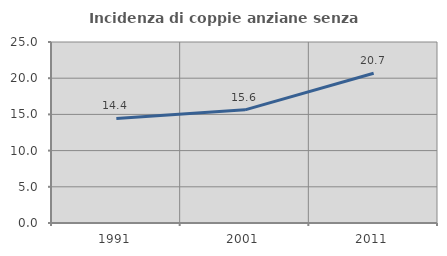
| Category | Incidenza di coppie anziane senza figli  |
|---|---|
| 1991.0 | 14.448 |
| 2001.0 | 15.627 |
| 2011.0 | 20.683 |